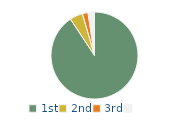
| Category | Series 0 |
|---|---|
| 1st | 90.7 |
| 2nd | 4.8 |
| 3rd | 2.1 |